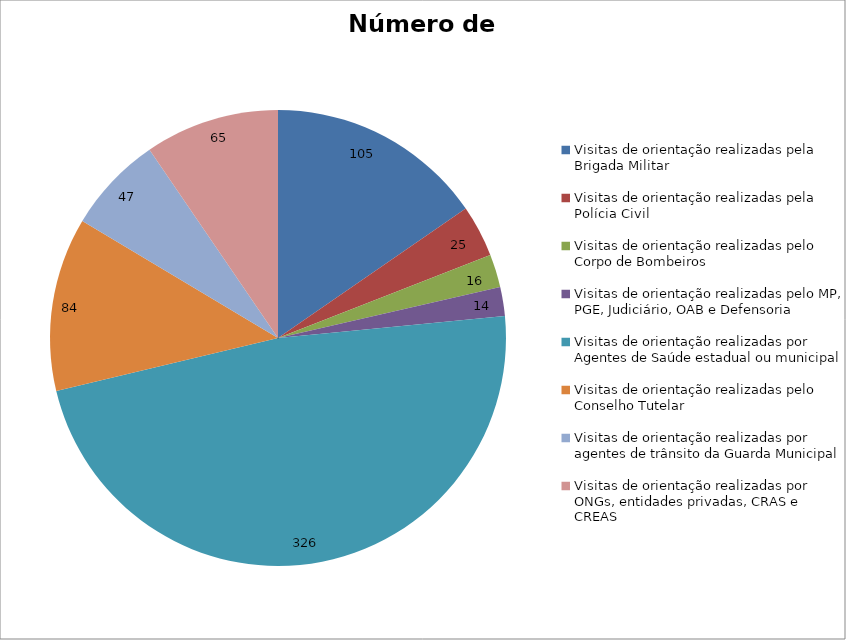
| Category | Número de Ações |
|---|---|
| Visitas de orientação realizadas pela Brigada Militar | 105 |
| Visitas de orientação realizadas pela Polícia Civil | 25 |
| Visitas de orientação realizadas pelo Corpo de Bombeiros | 16 |
| Visitas de orientação realizadas pelo MP, PGE, Judiciário, OAB e Defensoria | 14 |
| Visitas de orientação realizadas por Agentes de Saúde estadual ou municipal | 326 |
| Visitas de orientação realizadas pelo Conselho Tutelar | 84 |
| Visitas de orientação realizadas por agentes de trânsito da Guarda Municipal | 47 |
| Visitas de orientação realizadas por ONGs, entidades privadas, CRAS e CREAS | 65 |